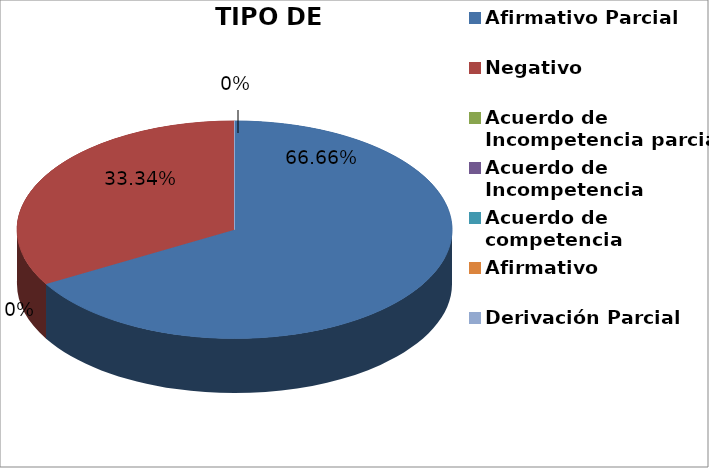
| Category | Series 0 |
|---|---|
| Afirmativo Parcial | 4 |
| Negativo | 2 |
| Acuerdo de Incompetencia parcial | 0 |
| Acuerdo de Incompetencia | 0 |
| Acuerdo de competencia | 0 |
| Afirmativo | 0 |
| Derivación Parcial | 0 |